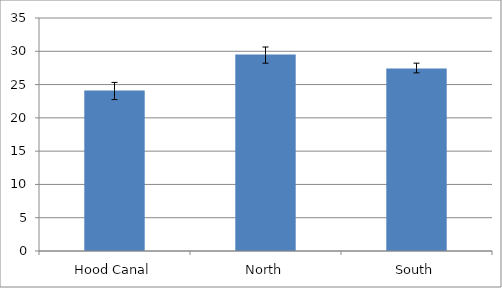
| Category | Series 0 |
|---|---|
| Hood Canal | 24.093 |
| North | 29.5 |
| South | 27.405 |